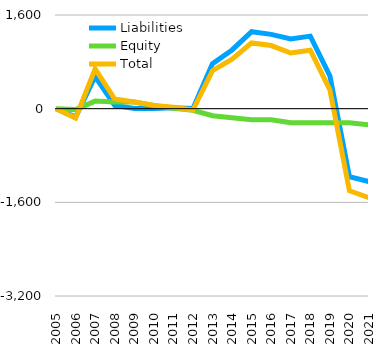
| Category | Liabilities  | Equity  | Total  |
|---|---|---|---|
| 2005 | 0 | 0 | 0 |
| 2006 | -145 | -16 | -161 |
| 2007 | 549 | 129 | 678 |
| 2008 | 53 | 112 | 165 |
| 2009 | 3 | 112 | 115 |
| 2010 | 3 | 53 | 56 |
| 2011 | 16 | 8 | 24 |
| 2012 | 3 | -27 | -24 |
| 2013 | 770 | -121 | 649 |
| 2014 | 1003 | -156 | 847 |
| 2015 | 1314 | -191 | 1123 |
| 2016 | 1269 | -191 | 1078 |
| 2017 | 1190 | -240 | 950 |
| 2018 | 1239 | -240 | 999 |
| 2019 | 561 | -240 | 321 |
| 2020 | -1162 | -240 | -1402 |
| 2021 | -1247.3 | -274.7 | -1522 |